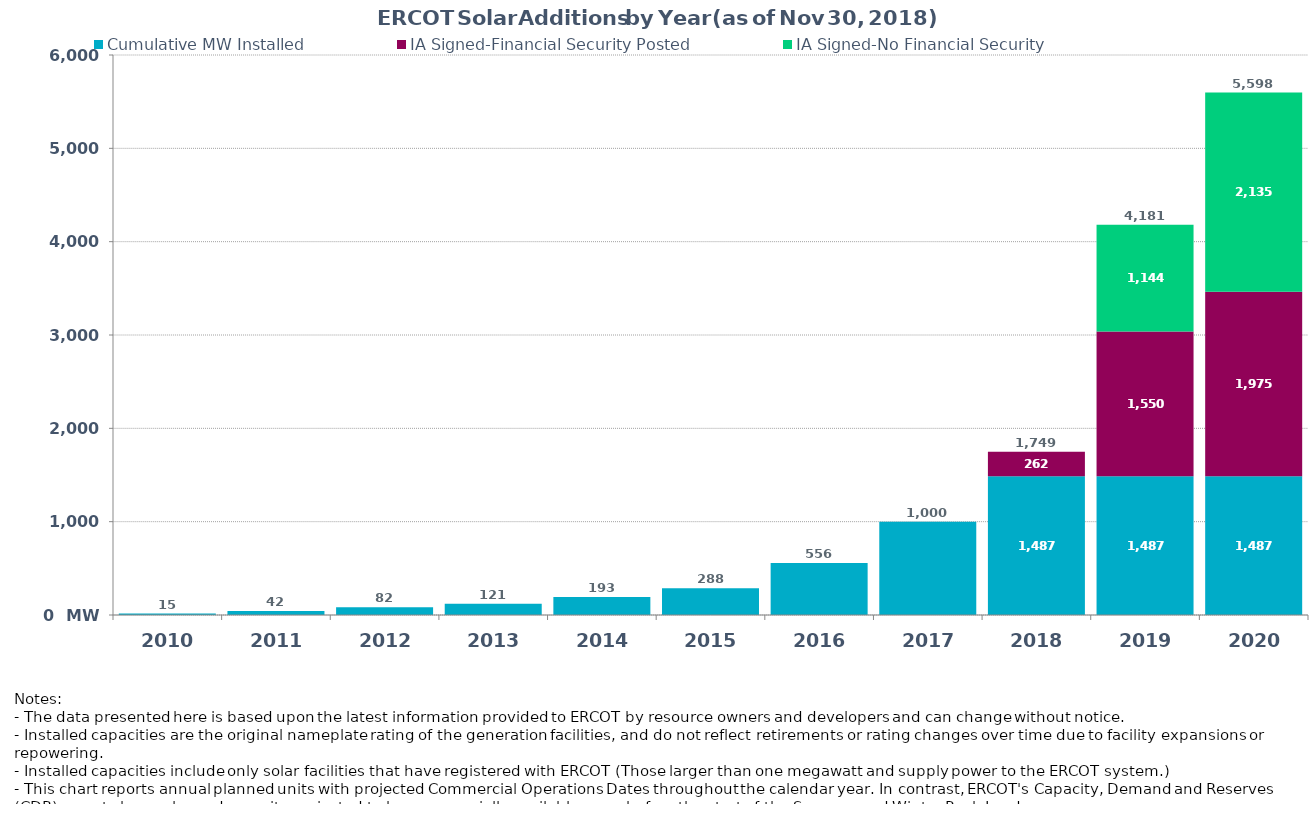
| Category | Cumulative MW Installed | IA Signed-Financial Security Posted  | IA Signed-No Financial Security  | Cumulative Installed and Planned |
|---|---|---|---|---|
| 2010.0 | 15 | 0 | 0 | 15 |
| 2011.0 | 42 | 0 | 0 | 42 |
| 2012.0 | 82 | 0 | 0 | 82 |
| 2013.0 | 121 | 0 | 0 | 121 |
| 2014.0 | 193 | 0 | 0 | 193 |
| 2015.0 | 287.7 | 0 | 0 | 287.7 |
| 2016.0 | 556 | 0 | 0 | 556 |
| 2017.0 | 1000 | 0 | 0 | 1000 |
| 2018.0 | 1487 | 262 | 0 | 1749 |
| 2019.0 | 1487 | 1550.2 | 1144 | 4181.2 |
| 2020.0 | 1487 | 1975.2 | 2135.3 | 5597.5 |